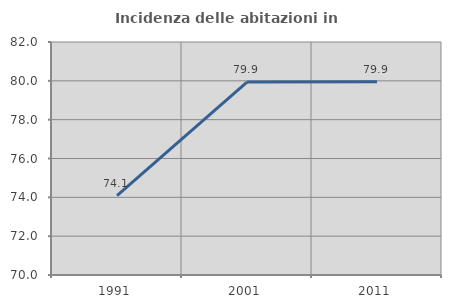
| Category | Incidenza delle abitazioni in proprietà  |
|---|---|
| 1991.0 | 74.087 |
| 2001.0 | 79.935 |
| 2011.0 | 79.949 |